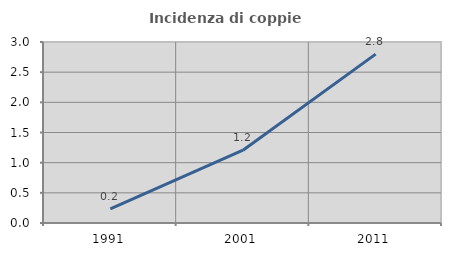
| Category | Incidenza di coppie miste |
|---|---|
| 1991.0 | 0.236 |
| 2001.0 | 1.207 |
| 2011.0 | 2.799 |